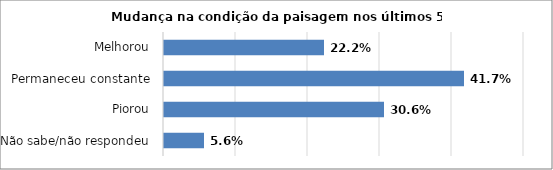
| Category | Series 0 |
|---|---|
| Não sabe/não respondeu | 0.056 |
| Piorou | 0.306 |
| Permaneceu constante | 0.417 |
| Melhorou | 0.222 |